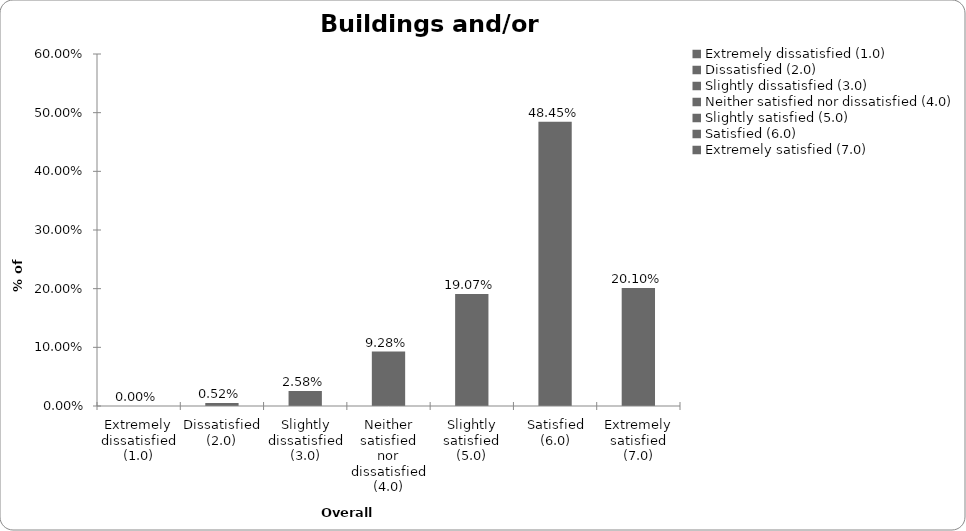
| Category | Series 0 |
|---|---|
| Extremely dissatisfied (1.0) | 0 |
| Dissatisfied (2.0) | 0.005 |
| Slightly dissatisfied (3.0) | 0.026 |
| Neither satisfied nor dissatisfied (4.0) | 0.093 |
| Slightly satisfied (5.0) | 0.191 |
| Satisfied (6.0) | 0.485 |
| Extremely satisfied (7.0) | 0.201 |